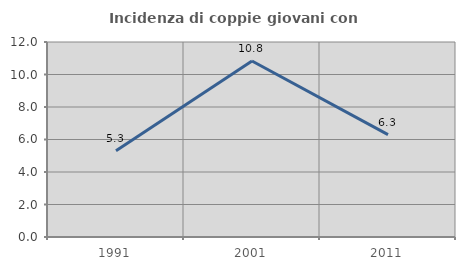
| Category | Incidenza di coppie giovani con figli |
|---|---|
| 1991.0 | 5.31 |
| 2001.0 | 10.833 |
| 2011.0 | 6.299 |